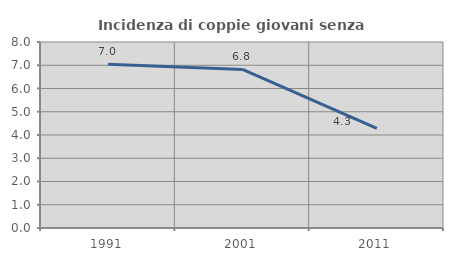
| Category | Incidenza di coppie giovani senza figli |
|---|---|
| 1991.0 | 7.047 |
| 2001.0 | 6.822 |
| 2011.0 | 4.283 |